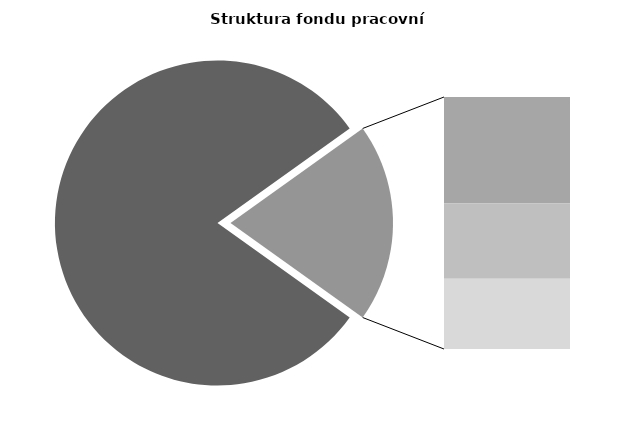
| Category | Series 0 |
|---|---|
| Průměrná měsíční odpracovaná doba bez přesčasu | 136.66 |
| Dovolená | 14.202 |
| Nemoc | 10.066 |
| Jiné | 9.392 |